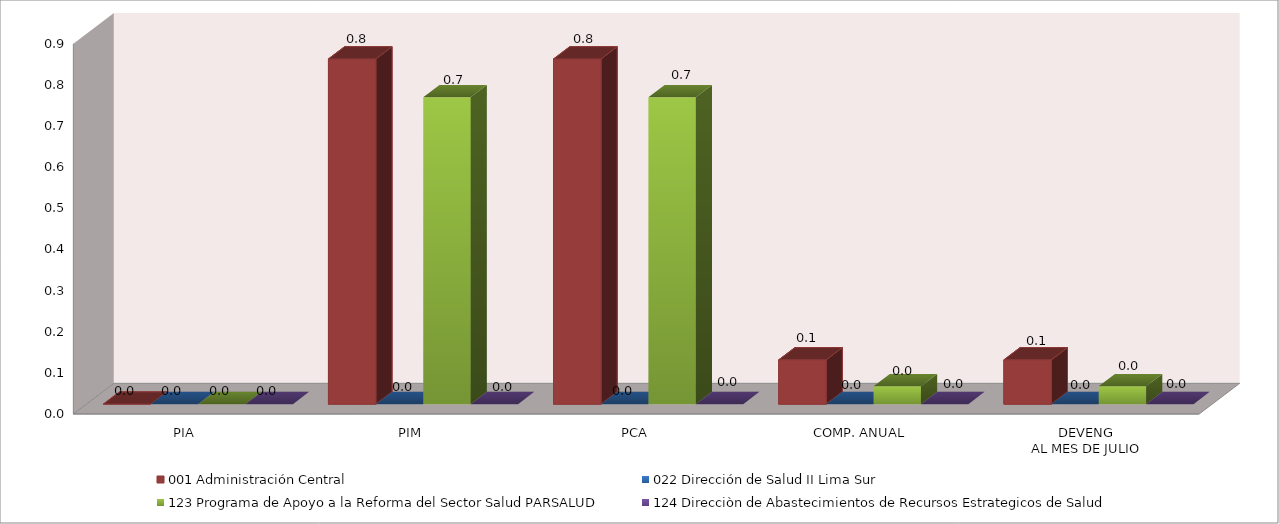
| Category | 001 Administración Central | 022 Dirección de Salud II Lima Sur | 123 Programa de Apoyo a la Reforma del Sector Salud PARSALUD | 124 Direcciòn de Abastecimientos de Recursos Estrategicos de Salud |
|---|---|---|---|---|
| PIA | 0 | 0 | 0 | 0 |
| PIM | 0.839 | 0 | 0.746 | 0 |
| PCA | 0.839 | 0 | 0.746 | 0 |
| COMP. ANUAL | 0.108 | 0 | 0.043 | 0 |
| DEVENG
AL MES DE JULIO | 0.108 | 0 | 0.043 | 0 |